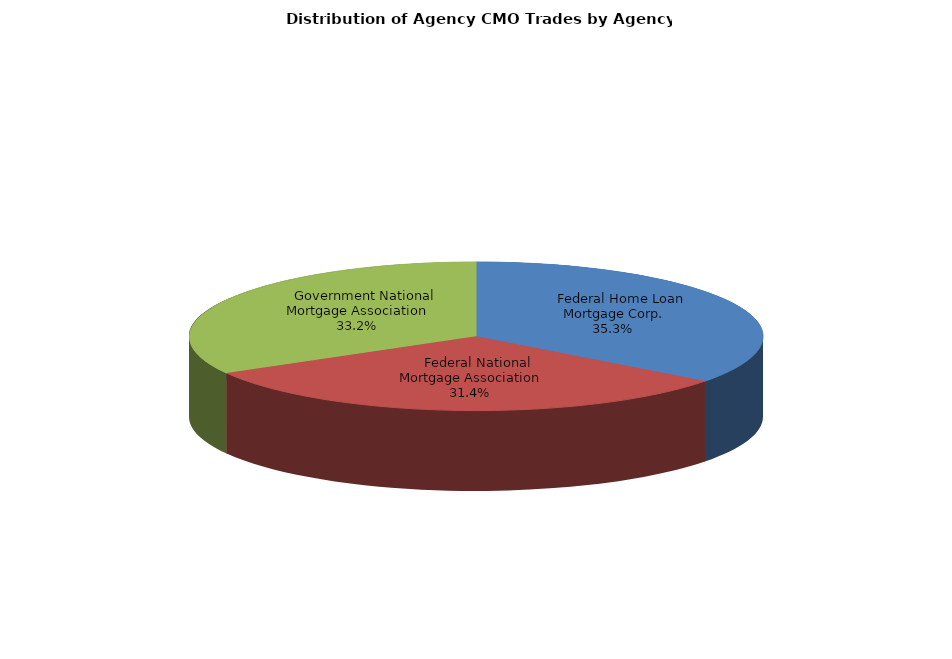
| Category | Series 0 |
|---|---|
|     Federal Home Loan Mortgage Corp. | 476.337 |
|     Federal National Mortgage Association | 424.214 |
|     Government National Mortgage Association | 448.377 |